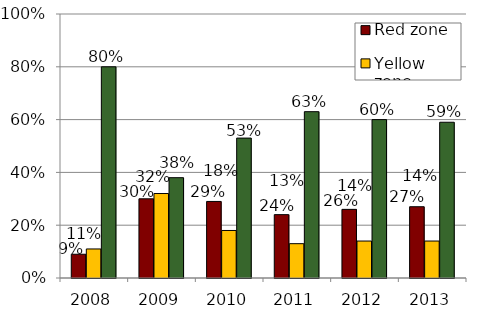
| Category | Red zone | Yellow zone | Green zone |
|---|---|---|---|
| 2008.0 | 0.09 | 0.11 | 0.8 |
| 2009.0 | 0.3 | 0.32 | 0.38 |
| 2010.0 | 0.29 | 0.18 | 0.53 |
| 2011.0 | 0.24 | 0.13 | 0.63 |
| 2012.0 | 0.26 | 0.14 | 0.6 |
| 2013.0 | 0.27 | 0.14 | 0.59 |